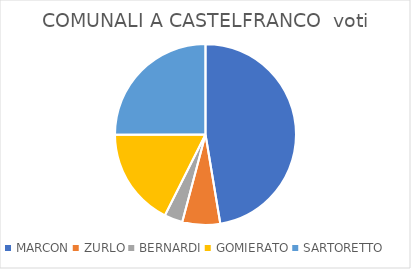
| Category | COMUNALI A CASTELFRANCO  |
|---|---|
| MARCON | 8486 |
| ZURLO | 1210 |
| BERNARDI | 585 |
| GOMIERATO | 3141 |
| SARTORETTO | 4489 |